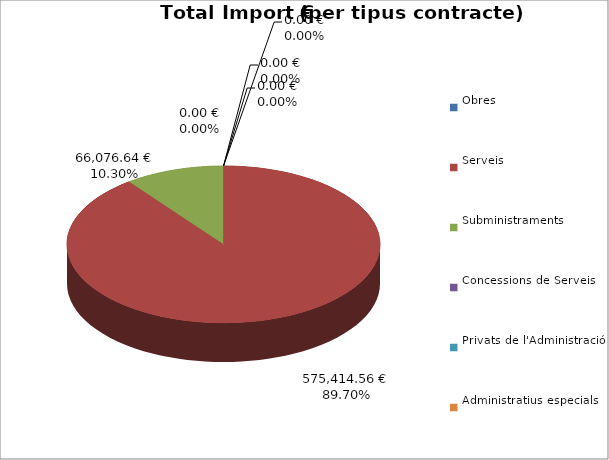
| Category | Total preu
(amb IVA) |
|---|---|
| Obres | 0 |
| Serveis | 575414.56 |
| Subministraments | 66076.64 |
| Concessions de Serveis | 0 |
| Privats de l'Administració | 0 |
| Administratius especials | 0 |